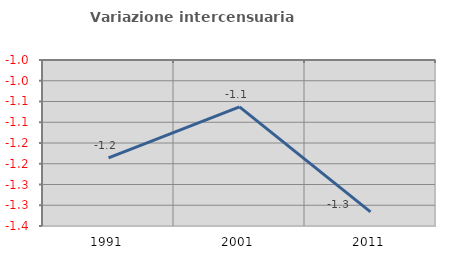
| Category | Variazione intercensuaria annua |
|---|---|
| 1991.0 | -1.186 |
| 2001.0 | -1.063 |
| 2011.0 | -1.316 |